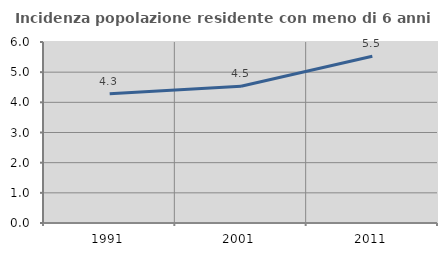
| Category | Incidenza popolazione residente con meno di 6 anni |
|---|---|
| 1991.0 | 4.283 |
| 2001.0 | 4.534 |
| 2011.0 | 5.53 |